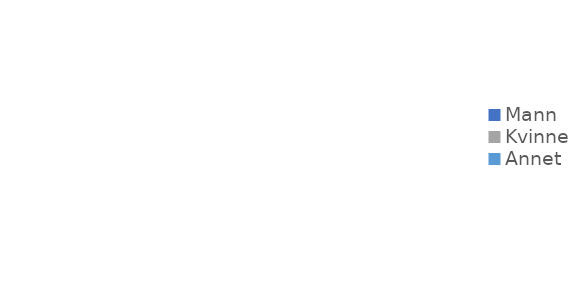
| Category | Series 0 |
|---|---|
| Mann | 0 |
| Kvinne | 0 |
| Annet | 0 |